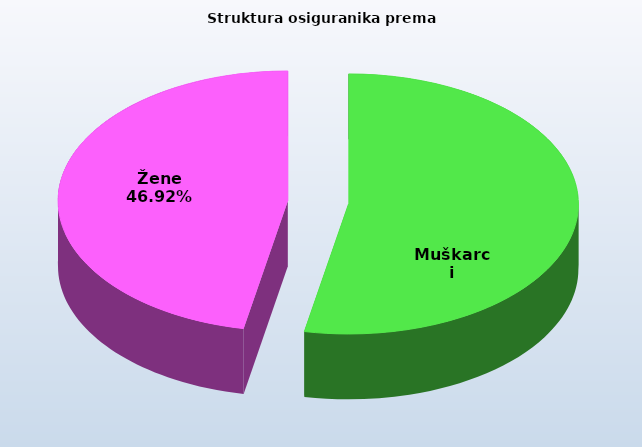
| Category | Series 0 |
|---|---|
| Muškarci | 824783 |
| Žene | 729096 |